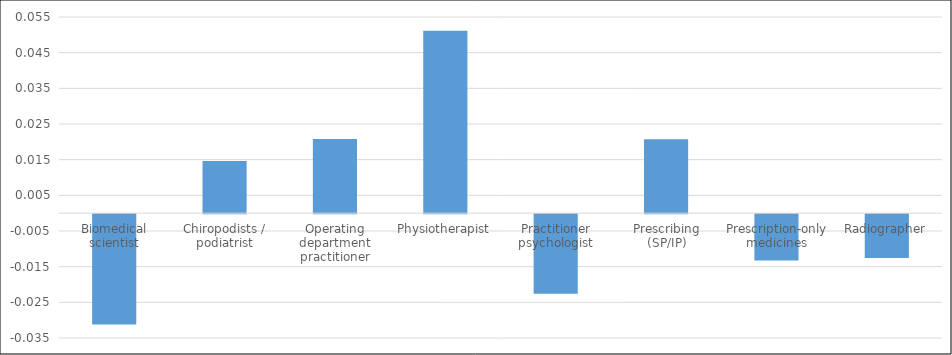
| Category | Series 0 |
|---|---|
| Biomedical scientist | -0.031 |
| Chiropodists / podiatrist | 0.015 |
| Operating department practitioner | 0.021 |
| Physiotherapist | 0.051 |
| Practitioner psychologist | -0.022 |
| Prescribing (SP/IP) | 0.021 |
| Prescription-only medicines | -0.013 |
| Radiographer | -0.012 |